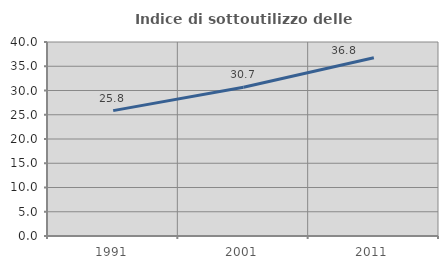
| Category | Indice di sottoutilizzo delle abitazioni  |
|---|---|
| 1991.0 | 25.847 |
| 2001.0 | 30.686 |
| 2011.0 | 36.766 |